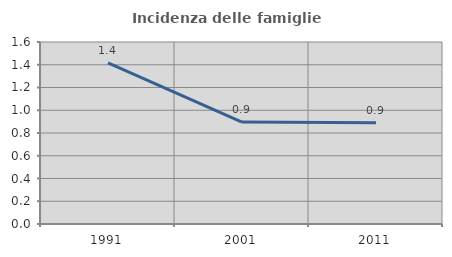
| Category | Incidenza delle famiglie numerose |
|---|---|
| 1991.0 | 1.417 |
| 2001.0 | 0.896 |
| 2011.0 | 0.89 |